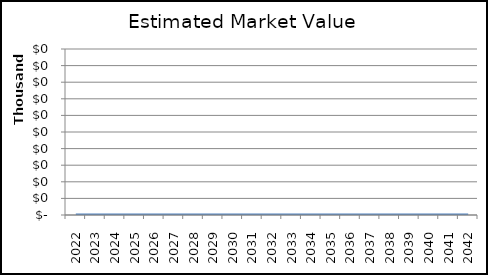
| Category | Series 0 |
|---|---|
| 2022.0 | 0 |
| 2023.0 | 0 |
| 2024.0 | 0 |
| 2025.0 | 0 |
| 2026.0 | 0 |
| 2027.0 | 0 |
| 2028.0 | 0 |
| 2029.0 | 0 |
| 2030.0 | 0 |
| 2031.0 | 0 |
| 2032.0 | 0 |
| 2033.0 | 0 |
| 2034.0 | 0 |
| 2035.0 | 0 |
| 2036.0 | 0 |
| 2037.0 | 0 |
| 2038.0 | 0 |
| 2039.0 | 0 |
| 2040.0 | 0 |
| 2041.0 | 0 |
| 2042.0 | 0 |